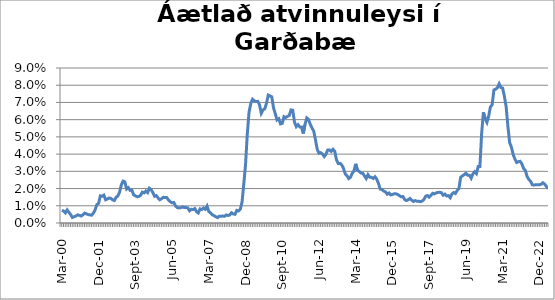
| Category | Series 0 |
|---|---|
| mar.00 | 0.007 |
| apr.00 | 0.007 |
| maí.00 | 0.006 |
| jún.00 | 0.008 |
| júl.00 | 0.006 |
| ágú.00 | 0.005 |
| sep.00 | 0.003 |
| okt.00 | 0.004 |
| nóv.00 | 0.004 |
| des.00 | 0.005 |
| jan.01 | 0.004 |
| feb.01 | 0.004 |
| mar.01 | 0.005 |
| apr.01 | 0.006 |
| maí.01 | 0.005 |
| jún.01 | 0.005 |
| júl.01 | 0.005 |
| ágú.01 | 0.005 |
| sep.01 | 0.006 |
| okt.01 | 0.008 |
| nóv.01 | 0.011 |
| des.01 | 0.011 |
| jan.02 | 0.016 |
| feb.02 | 0.016 |
| mar.02 | 0.016 |
| apr.02 | 0.013 |
| maí.02 | 0.014 |
| jún.02 | 0.015 |
| júl.02 | 0.014 |
| ágú.02 | 0.013 |
| sep.02 | 0.013 |
| okt.02 | 0.015 |
| nóv.02 | 0.016 |
| des.02 | 0.018 |
| jan.03 | 0.022 |
| feb.03 | 0.024 |
| mar.03 | 0.024 |
| apr.03 | 0.02 |
| maí.03 | 0.021 |
| jún.03 | 0.019 |
| júl.03 | 0.019 |
| ágú.03 | 0.016 |
| sep.03 | 0.016 |
| okt.03 | 0.015 |
| nóv.03 | 0.015 |
| des.03 | 0.016 |
| jan.04 | 0.018 |
| feb.04 | 0.017 |
| mar.04 | 0.019 |
| apr.04 | 0.018 |
| maí.04 | 0.02 |
| jún.04 | 0.019 |
| júl.04 | 0.018 |
| ágú.04 | 0.016 |
| sep.04 | 0.016 |
| okt.04 | 0.015 |
| nóv.04 | 0.014 |
| des.04 | 0.014 |
| jan.05 | 0.015 |
| feb.05 | 0.015 |
| mar.05 | 0.015 |
| apr.05 | 0.013 |
| maí.05 | 0.012 |
| jún.05 | 0.012 |
| júl.05 | 0.012 |
| ágú.05 | 0.01 |
| sep.05 | 0.009 |
| okt.05 | 0.009 |
| nóv.05 | 0.009 |
| des.05 | 0.009 |
| jan.06 | 0.009 |
| feb.06 | 0.009 |
| mar.06 | 0.009 |
| apr.06 | 0.007 |
| maí.06 | 0.008 |
| jún.06 | 0.008 |
| júl.06 | 0.008 |
| ágú.06 | 0.007 |
| sep.06 | 0.006 |
| okt.06 | 0.008 |
| nóv.06 | 0.008 |
| des.06 | 0.009 |
| jan.07 | 0.008 |
| feb.07 | 0.01 |
| mar.07 | 0.007 |
| apr.07 | 0.006 |
| maí.07 | 0.005 |
| jún.07 | 0.004 |
| júl.07 | 0.004 |
| ágú.07 | 0.003 |
| sep.07 | 0.004 |
| okt.07 | 0.004 |
| nóv.07 | 0.004 |
| des.07 | 0.004 |
| jan.08 | 0.005 |
| feb.08 | 0.004 |
| mar.08 | 0.005 |
| apr.08 | 0.006 |
| maí.08 | 0.005 |
| jún.08 | 0.005 |
| júl.08 | 0.007 |
| ágú.08 | 0.007 |
| sep.08 | 0.008 |
| okt.08 | 0.012 |
| nóv.08 | 0.023 |
| des.08 | 0.034 |
| jan.09 | 0.051 |
| feb.09 | 0.064 |
| mar.09 | 0.069 |
| apr.09 | 0.072 |
| maí.09 | 0.071 |
| jún.09 | 0.07 |
| júl.09 | 0.071 |
| ágú.09 | 0.069 |
| sep.09 | 0.064 |
| okt.09 | 0.066 |
| nóv.09 | 0.066 |
| des.09 | 0.07 |
| jan.10 | 0.074 |
| feb.10 | 0.074 |
| mar.10 | 0.073 |
| apr.10 | 0.067 |
| maí.10 | 0.064 |
| jún.10 | 0.06 |
| júl.10 | 0.061 |
| ágú.10 | 0.058 |
| sep.10 | 0.058 |
| okt.10 | 0.062 |
| nóv.10 | 0.061 |
| des.10 | 0.062 |
| jan.11 | 0.062 |
| feb.11 | 0.066 |
| mar.11 | 0.065 |
| apr.11 | 0.059 |
| maí.11 | 0.056 |
| jún.11 | 0.057 |
| júl.11 | 0.056 |
| ágú.11 | 0.056 |
| sep.11 | 0.052 |
| okt.11 | 0.057 |
| nóv.11 | 0.061 |
| des.11 | 0.06 |
| jan.12 | 0.057 |
| feb.12 | 0.055 |
| mar.12 | 0.053 |
| apr.12 | 0.048 |
| maí.12 | 0.043 |
| jún.12 | 0.04 |
| júl.12 | 0.041 |
| ágú.12 | 0.04 |
| sep.12 | 0.039 |
| okt.12 | 0.04 |
| nóv.12 | 0.042 |
| des.12 | 0.042 |
| jan.2013* | 0.042 |
| feb.13 | 0.043 |
| mar.13 | 0.042 |
| apr.13 | 0.037 |
| maí.13 | 0.035 |
| jún.13 | 0.035 |
| júl.13 | 0.034 |
| ágú.13 | 0.032 |
| sep.13 | 0.029 |
| okt.13 | 0.027 |
| nóv.13 | 0.026 |
| des.13 | 0.027 |
| jan.14 | 0.029 |
| feb.14 | 0.03 |
| mar.14 | 0.034 |
| apr.14 | 0.031 |
| maí.14 | 0.03 |
| jún.14 | 0.029 |
| júl.14 | 0.029 |
| ágú.14 | 0.027 |
| sep.14 | 0.026 |
| okt.14 | 0.028 |
| nóv.14 | 0.027 |
| des.14 | 0.027 |
| jan.15 | 0.026 |
| feb.15 | 0.027 |
| mar.15 | 0.026 |
| apr.15 | 0.023 |
| maí.15 | 0.02 |
| jún.15 | 0.019 |
| júl.15 | 0.019 |
| ágú.15 | 0.018 |
| sep.15 | 0.017 |
| okt.15 | 0.017 |
| nóv.15 | 0.016 |
| des.15 | 0.017 |
| jan.16 | 0.017 |
| feb.16 | 0.017 |
| mar.16 | 0.017 |
| apr.16 | 0.016 |
| maí.16 | 0.015 |
| jún.16 | 0.015 |
| júl.16 | 0.014 |
| ágú.16 | 0.013 |
| sep.16 | 0.013 |
| okt.16 | 0.014 |
| nóv.16 | 0.013 |
| des.16 | 0.012 |
| jan.17 | 0.013 |
| feb.17 | 0.013 |
| mar.17 | 0.013 |
| apr.17 | 0.012 |
| maí.17 | 0.013 |
| jún.17 | 0.014 |
| júl.17 | 0.016 |
| ágú.17 | 0.016 |
| sep.17 | 0.015 |
| okt.17 | 0.016 |
| nóv.17 | 0.017 |
| des.17 | 0.017 |
| jan.18 | 0.017 |
| feb.18 | 0.018 |
| mar.18 | 0.018 |
| apr.18 | 0.018 |
| maí.18 | 0.016 |
| jún.18 | 0.017 |
| júl.18 | 0.016 |
| ágú.18 | 0.016 |
| sep.18 | 0.015 |
| okt.18 | 0.017 |
| nóv.18 | 0.018 |
| des.18 | 0.017 |
| jan.19 | 0.019 |
| feb.19 | 0.02 |
| mar.19 | 0.027 |
| apr.19 | 0.027 |
| maí.19 | 0.028 |
| jún.19 | 0.029 |
| júl.19 | 0.028 |
| ágú.19 | 0.028 |
| sep.19 | 0.026 |
| okt.19 | 0.029 |
| nóv.19 | 0.03 |
| des.19 | 0.029 |
| jan.20 | 0.033 |
| feb.20 | 0.033 |
| mars 2020*** | 0.052 |
| apr.20 | 0.064 |
| maí.20 | 0.061 |
| jún.20 | 0.058 |
| júl.20 | 0.062 |
| ágú.20 | 0.067 |
| sep.20 | 0.069 |
| okt.20 | 0.077 |
| nóv.20 | 0.078 |
| des.20 | 0.079 |
| jan.21 | 0.081 |
| feb.21 | 0.079 |
| mar.21 | 0.078 |
| apr.21 | 0.074 |
| maí.21 | 0.068 |
| jún.21 | 0.056 |
| júl.21 | 0.047 |
| ágú.21 | 0.044 |
| sep.21 | 0.04 |
| okt.21 | 0.037 |
| nóv.21 | 0.035 |
| des.21 | 0.036 |
| jan.22 | 0.036 |
| feb.22 | 0.034 |
| mar.22 | 0.032 |
| apr.22 | 0.03 |
| maí.22 | 0.027 |
| jún.22 | 0.025 |
| júl.22 | 0.024 |
| ágú.22 | 0.022 |
| sep.22 | 0.022 |
| okt.22 | 0.022 |
| nóv.22 | 0.022 |
| des.22 | 0.022 |
| jan.23 | 0.022 |
| feb.23 | 0.023 |
| mar.23 | 0.023 |
| apr.23 | 0.021 |
| maí.23 | 0.02 |